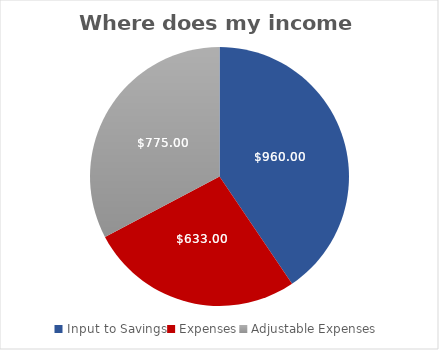
| Category | Series 0 |
|---|---|
| Input to Savings | 960 |
| Expenses | 633 |
| Adjustable Expenses | 775 |